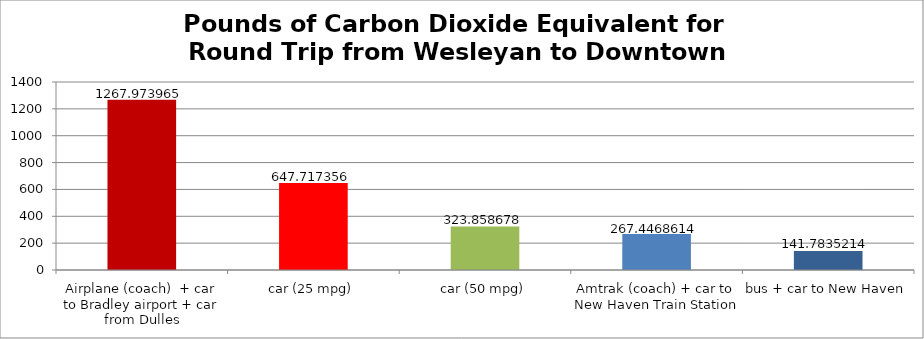
| Category | lb CO2e |
|---|---|
| Airplane (coach)  + car to Bradley airport + car from Dulles | 1267.974 |
| car (25 mpg) | 647.717 |
| car (50 mpg) | 323.859 |
| Amtrak (coach) + car to New Haven Train Station | 267.447 |
| bus + car to New Haven | 141.784 |